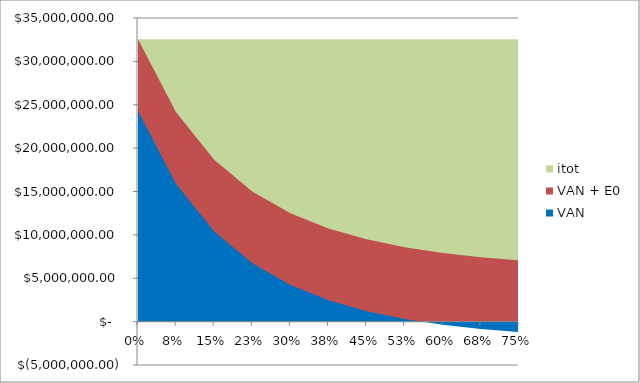
| Category | itot | VAN + E0 | VAN |
|---|---|---|---|
| 0.0 | 32562317.074 | 32562317.074 | 24286877.319 |
| 0.075 | 32562317.074 | 24133573.433 | 15858133.679 |
| 0.15 | 32562317.074 | 18662692.504 | 10387252.749 |
| 0.22499999999999998 | 32562317.074 | 15003668.51 | 6728228.756 |
| 0.3 | 32562317.074 | 12493888.089 | 4218448.334 |
| 0.375 | 32562317.074 | 10735515.474 | 2460075.72 |
| 0.45 | 32562317.074 | 9481644.997 | 1206205.243 |
| 0.525 | 32562317.074 | 8574487.441 | 299047.687 |
| 0.6 | 32562317.074 | 7910544.874 | -364894.88 |
| 0.6749999999999999 | 32562317.074 | 7420333.092 | -855106.662 |
| 0.75 | 32562317.074 | 7056220.301 | -1219219.453 |